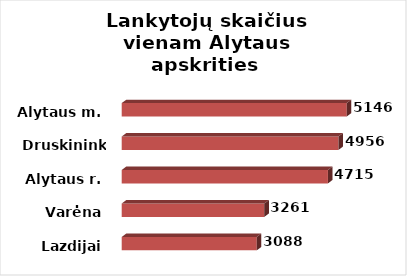
| Category | Series 0 |
|---|---|
| Lazdijai | 3088 |
| Varėna | 3261 |
| Alytaus r. | 4715 |
| Druskininkai | 4956 |
| Alytaus m. | 5146 |